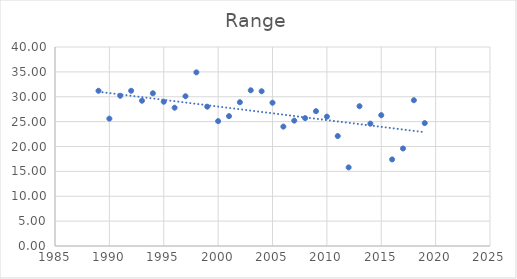
| Category | Range |
|---|---|
| 1989.0 | 31.2 |
| 1990.0 | 25.6 |
| 1991.0 | 30.2 |
| 1992.0 | 31.2 |
| 1993.0 | 29.2 |
| 1994.0 | 30.7 |
| 1995.0 | 29 |
| 1996.0 | 27.8 |
| 1997.0 | 30.1 |
| 1998.0 | 34.9 |
| 1999.0 | 28 |
| 2000.0 | 25.1 |
| 2001.0 | 26.1 |
| 2002.0 | 28.9 |
| 2003.0 | 31.3 |
| 2004.0 | 31.1 |
| 2005.0 | 28.8 |
| 2006.0 | 24 |
| 2007.0 | 25.2 |
| 2008.0 | 25.7 |
| 2009.0 | 27.1 |
| 2010.0 | 26 |
| 2011.0 | 22.1 |
| 2012.0 | 15.8 |
| 2013.0 | 28.1 |
| 2014.0 | 24.6 |
| 2015.0 | 26.3 |
| 2016.0 | 17.4 |
| 2017.0 | 19.6 |
| 2018.0 | 29.3 |
| 2019.0 | 24.7 |